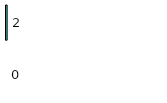
| Category | Series 0 | Series 1 |
|---|---|---|
| 0 | 0 | 2 |